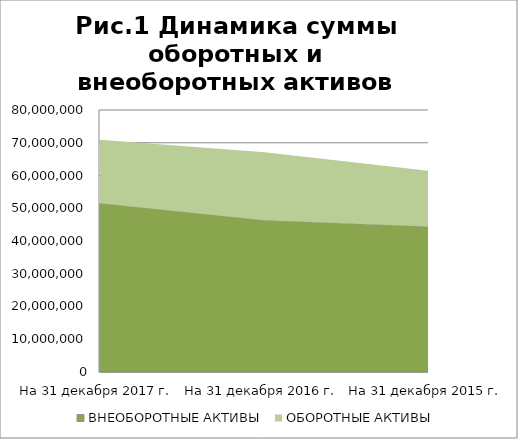
| Category | ВНЕОБОРОТНЫЕ АКТИВЫ | ОБОРОТНЫЕ АКТИВЫ |
|---|---|---|
| На 31 декабря 2017 г. | 51532127 | 19379793 |
| На 31 декабря 2016 г. | 46352267 | 20727348 |
| На 31 декабря 2015 г. | 44450078 | 16940153 |